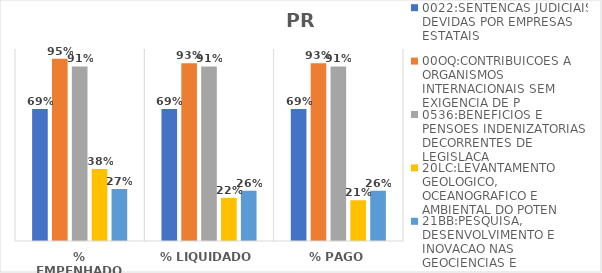
| Category | 0022:SENTENCAS JUDICIAIS DEVIDAS POR EMPRESAS ESTATAIS | 00OQ:CONTRIBUICOES A ORGANISMOS INTERNACIONAIS SEM EXIGENCIA DE P | 0536:BENEFICIOS E PENSOES INDENIZATORIAS DECORRENTES DE LEGISLACA | 20LC:LEVANTAMENTO GEOLOGICO, OCEANOGRAFICO E AMBIENTAL DO POTEN | 21BB:PESQUISA, DESENVOLVIMENTO E INOVACAO NAS GEOCIENCIAS E |
|---|---|---|---|---|---|
| % EMPENHADO | 0.688 | 0.95 | 0.909 | 0.375 | 0.271 |
| % LIQUIDADO | 0.688 | 0.926 | 0.909 | 0.225 | 0.262 |
| % PAGO | 0.688 | 0.926 | 0.909 | 0.212 | 0.262 |